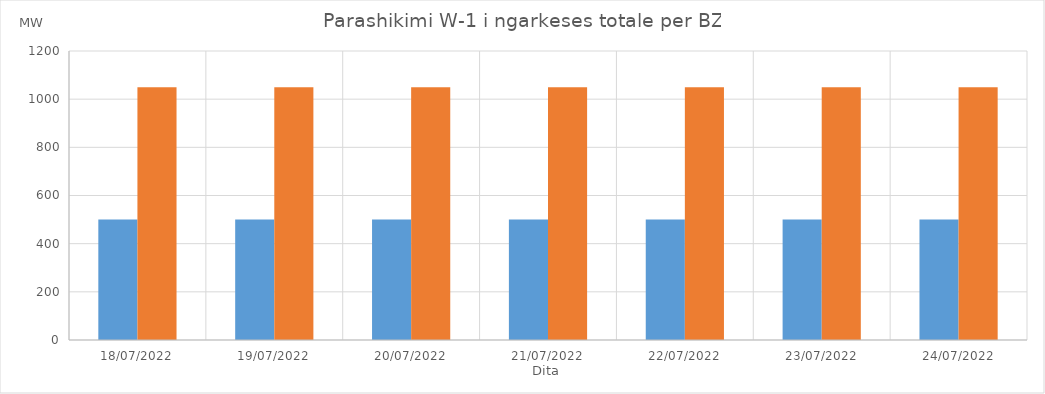
| Category | Min (MW) | Max (MW) |
|---|---|---|
| 18/07/2022 | 500 | 1050 |
| 19/07/2022 | 500 | 1050 |
| 20/07/2022 | 500 | 1050 |
| 21/07/2022 | 500 | 1050 |
| 22/07/2022 | 500 | 1050 |
| 23/07/2022 | 500 | 1050 |
| 24/07/2022 | 500 | 1050 |